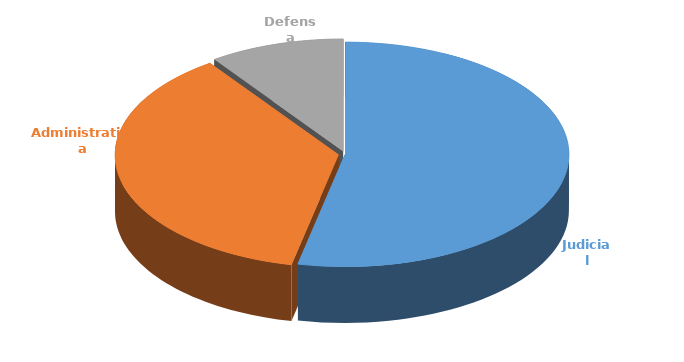
| Category | Cantidad |
|---|---|
| Judicial | 339 |
| Administrativa | 234 |
| Defensa | 62 |